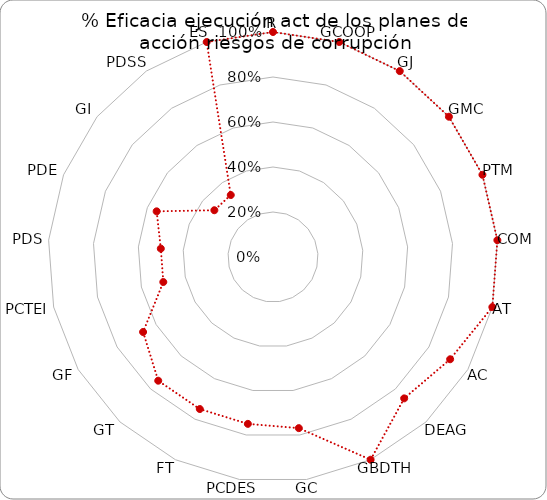
| Category | Series 0 |
|---|---|
| IR | 1 |
| GCOOP | 1 |
| GJ | 1 |
| GMC | 1 |
| PTM | 1 |
| COM | 1 |
| AT | 1 |
| AC | 0.909 |
| DEAG | 0.857 |
| GBDTH | 1 |
| GC | 0.769 |
| PCDES | 0.75 |
| FT | 0.75 |
| GT | 0.75 |
| GF | 0.667 |
| PCTEI | 0.5 |
| PDS | 0.5 |
| PDE | 0.556 |
| GI | 0.333 |
| PDSS | 0.333 |
| ES | 1 |